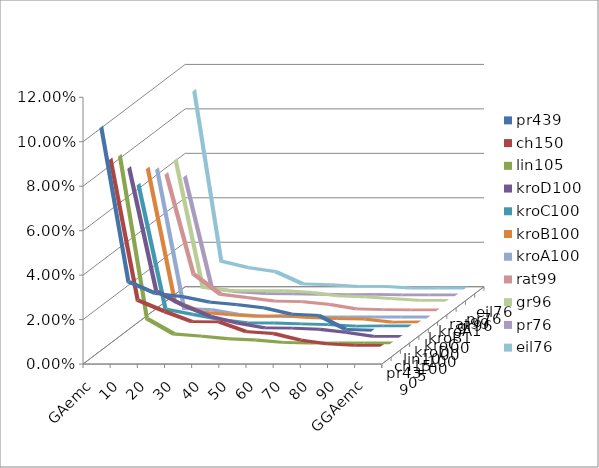
| Category | pr439 | ch150 | lin105 | kroD100 | kroC100 | kroB100 | kroA100 | rat99 | gr96 | pr76 | eil76 |
|---|---|---|---|---|---|---|---|---|---|---|---|
| 0 | 0.104 | 0.087 | 0.085 | 0.077 | 0.066 | 0.07 | 0.067 | 0.061 | 0.065 | 0.054 | 0.089 |
| 1 | 0.035 | 0.023 | 0.012 | 0.021 | 0.01 | 0.01 | 0.004 | 0.016 | 0.007 | 0.003 | 0.012 |
| 2 | 0.03 | 0.018 | 0.005 | 0.015 | 0.007 | 0.005 | 0.003 | 0.007 | 0.005 | 0.002 | 0.01 |
| 3 | 0.028 | 0.014 | 0.004 | 0.01 | 0.005 | 0.004 | 0.001 | 0.006 | 0.005 | 0.001 | 0.008 |
| 4 | 0.026 | 0.014 | 0.003 | 0.007 | 0.004 | 0.003 | 0 | 0.004 | 0.005 | 0.001 | 0.002 |
| 5 | 0.025 | 0.009 | 0.002 | 0.005 | 0.004 | 0.004 | 0 | 0.004 | 0.005 | 0.001 | 0.002 |
| 6 | 0.023 | 0.008 | 0.001 | 0.004 | 0.003 | 0.003 | 0 | 0.002 | 0.003 | 0.001 | 0.001 |
| 7 | 0.02 | 0.005 | 0.001 | 0.004 | 0.003 | 0.002 | 0 | 0 | 0.003 | 0.001 | 0.001 |
| 8 | 0.02 | 0.004 | 0.001 | 0.003 | 0.002 | 0.002 | 0 | 0 | 0.002 | 0 | 0 |
| 9 | 0.013 | 0.003 | 0.001 | 0.001 | 0.002 | 0.001 | 0 | 0 | 0.001 | 0 | 0 |
| 10 | 0.013 | 0.003 | 0.001 | 0.001 | 0.002 | 0.001 | 0 | 0 | 0.001 | 0 | 0 |